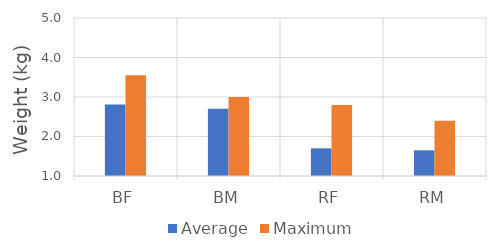
| Category | Average | Maximum |
|---|---|---|
| BF | 2.81 | 3.55 |
| BM | 2.7 | 3 |
| RF | 1.7 | 2.8 |
| RM | 1.65 | 2.4 |